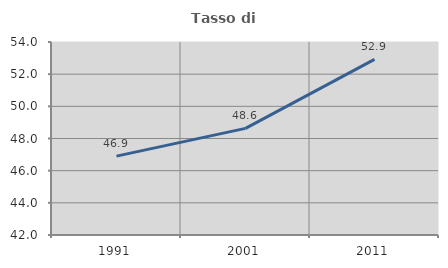
| Category | Tasso di occupazione   |
|---|---|
| 1991.0 | 46.904 |
| 2001.0 | 48.629 |
| 2011.0 | 52.922 |